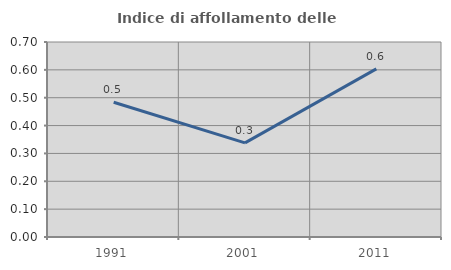
| Category | Indice di affollamento delle abitazioni  |
|---|---|
| 1991.0 | 0.484 |
| 2001.0 | 0.338 |
| 2011.0 | 0.603 |